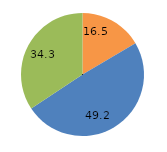
| Category | Series 0 |
|---|---|
|   ohne Abschluss, Sonderschulabschluss | 16.5 |
|   Hauptschulabschluss | 49.2 |
|   mittlerer Schulabschluss | 34.3 |